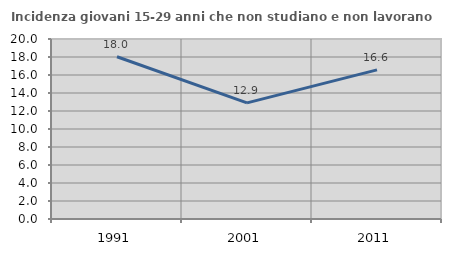
| Category | Incidenza giovani 15-29 anni che non studiano e non lavorano  |
|---|---|
| 1991.0 | 18.025 |
| 2001.0 | 12.903 |
| 2011.0 | 16.564 |